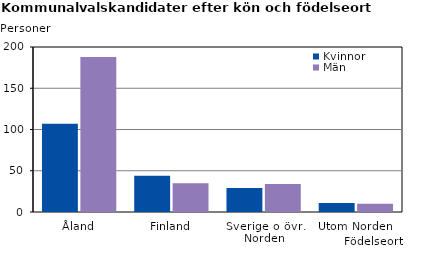
| Category | Kvinnor | Män |
|---|---|---|
| Åland | 107 | 188 |
| Finland | 44 | 35 |
| Sverige o övr. Norden | 29 | 34 |
| Utom Norden | 11 | 10 |